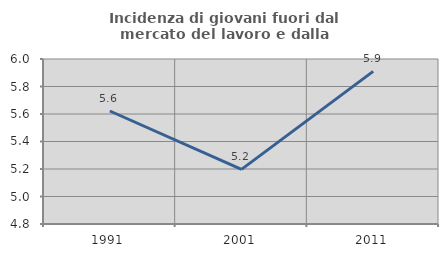
| Category | Incidenza di giovani fuori dal mercato del lavoro e dalla formazione  |
|---|---|
| 1991.0 | 5.622 |
| 2001.0 | 5.198 |
| 2011.0 | 5.91 |